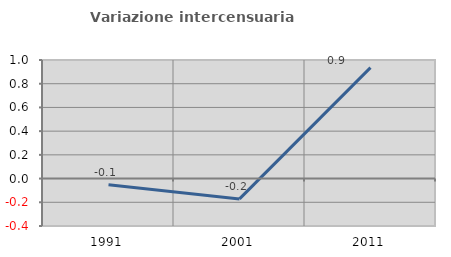
| Category | Variazione intercensuaria annua |
|---|---|
| 1991.0 | -0.052 |
| 2001.0 | -0.171 |
| 2011.0 | 0.936 |